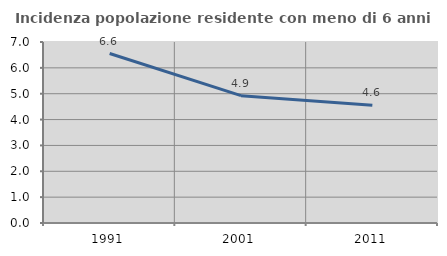
| Category | Incidenza popolazione residente con meno di 6 anni |
|---|---|
| 1991.0 | 6.555 |
| 2001.0 | 4.923 |
| 2011.0 | 4.555 |